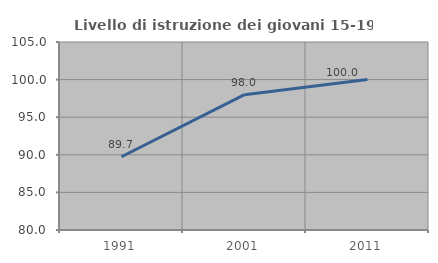
| Category | Livello di istruzione dei giovani 15-19 anni |
|---|---|
| 1991.0 | 89.744 |
| 2001.0 | 98 |
| 2011.0 | 100 |